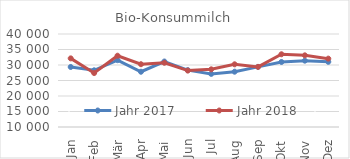
| Category | Jahr 2017 | Jahr 2018 |
|---|---|---|
| 0 | 29361.415 | 32136.672 |
| 1 | 28285.657 | 27406.427 |
| 2 | 31557.177 | 32994.638 |
| 3 | 27826.295 | 30253.248 |
| 4 | 31124.685 | 30717.736 |
| 5 | 28347.751 | 28199.517 |
| 6 | 27131.167 | 28600.797 |
| 7 | 27837.978 | 30222.59 |
| 8 | 29389.661 | 29396.854 |
| 9 | 30969.431 | 33462.093 |
| 10 | 31394.505 | 33118.164 |
| 11 | 31021.161 | 32051.477 |